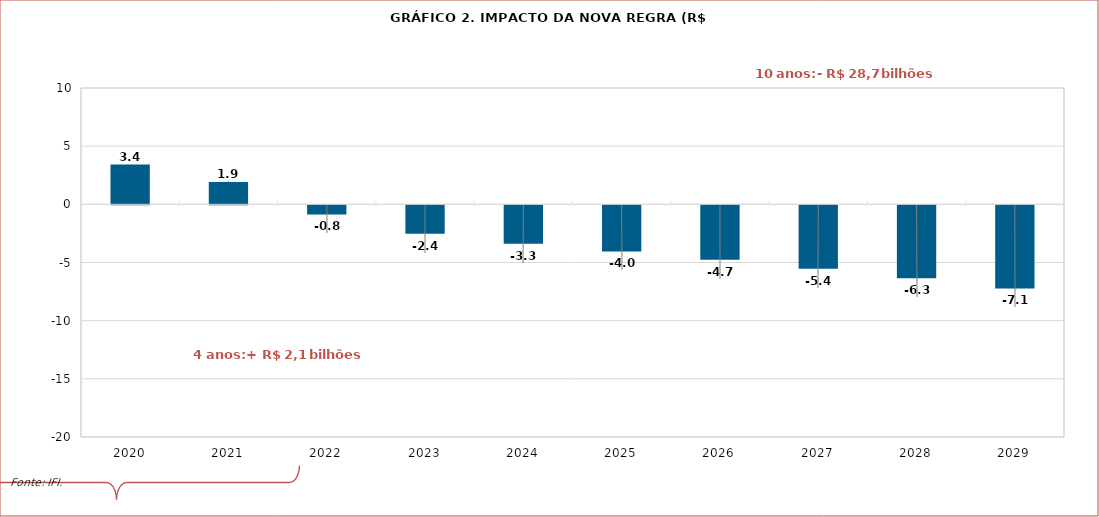
| Category | R$ (a preços de dez/18) |
|---|---|
| 2020 | 3422406225.217 |
| 2021 | 1909543646.721 |
| 2022 | -777899533.227 |
| 2023 | -2448975360.281 |
| 2024 | -3310882564.274 |
| 2025 | -3967067566.781 |
| 2026 | -4679730910.847 |
| 2027 | -5449210185.401 |
| 2028 | -6271436534.098 |
| 2029 | -7138325965.28 |